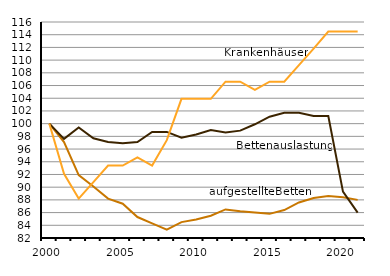
| Category | Aufgestellte Betten | Bettenauslastung | Krankenhäuser |
|---|---|---|---|
| 2000.0 | 100 | 100 | 100 |
| 2001.0 | 97.1 | 97.6 | 92.1 |
| 2002.0 | 91.9 | 99.4 | 88.2 |
| 2003.0 | 90.1 | 97.7 | 90.8 |
| 2004.0 | 88.2 | 97.1 | 93.4 |
| 2005.0 | 87.4 | 96.9 | 93.4 |
| 2006.0 | 85.3 | 97.1 | 94.7 |
| 2007.0 | 84.3 | 98.7 | 93.4 |
| 2008.0 | 83.3 | 98.7 | 97.4 |
| 2009.0 | 84.5 | 97.8 | 103.9 |
| 2010.0 | 84.9 | 98.3 | 103.9 |
| 2011.0 | 85.5 | 99 | 103.9 |
| 2012.0 | 86.5 | 98.6 | 106.6 |
| 2013.0 | 86.2 | 98.9 | 106.6 |
| 2014.0 | 86 | 99.9 | 105.3 |
| 2015.0 | 85.8 | 101.1 | 106.6 |
| 2016.0 | 86.4 | 101.7 | 106.6 |
| 2017.0 | 87.6 | 101.7 | 109.2 |
| 2018.0 | 88.3 | 101.2 | 111.8 |
| 2019.0 | 88.6 | 101.2 | 114.5 |
| 2020.0 | 88.4 | 89.3 | 114.5 |
| 2021.0 | 88 | 86 | 114.5 |